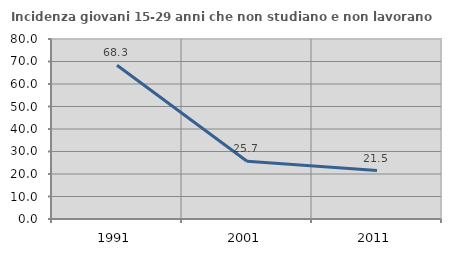
| Category | Incidenza giovani 15-29 anni che non studiano e non lavorano  |
|---|---|
| 1991.0 | 68.341 |
| 2001.0 | 25.688 |
| 2011.0 | 21.505 |